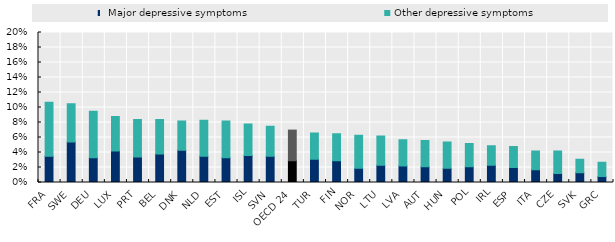
| Category | Major depressive symptoms | Other depressive symptoms |
|---|---|---|
| FRA | 0.035 | 0.072 |
| SWE | 0.054 | 0.051 |
| DEU | 0.033 | 0.062 |
| LUX | 0.042 | 0.046 |
| PRT | 0.034 | 0.05 |
| BEL | 0.038 | 0.046 |
| DNK | 0.043 | 0.039 |
| NLD | 0.035 | 0.048 |
| EST | 0.033 | 0.049 |
| ISL | 0.036 | 0.042 |
| SVN | 0.035 | 0.04 |
| OECD 24 | 0.029 | 0.041 |
| TUR | 0.031 | 0.035 |
| FIN | 0.029 | 0.036 |
| NOR | 0.019 | 0.044 |
| LTU | 0.023 | 0.039 |
| LVA | 0.022 | 0.035 |
| AUT | 0.021 | 0.035 |
| HUN | 0.019 | 0.035 |
| POL | 0.021 | 0.031 |
| IRL | 0.023 | 0.026 |
| ESP | 0.02 | 0.028 |
| ITA | 0.017 | 0.025 |
| CZE | 0.012 | 0.03 |
| SVK | 0.013 | 0.018 |
| GRC | 0.008 | 0.019 |